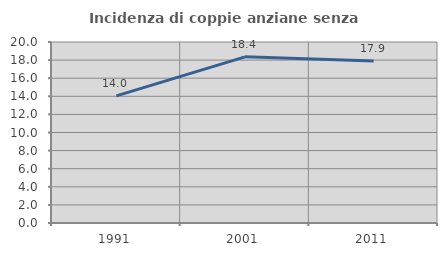
| Category | Incidenza di coppie anziane senza figli  |
|---|---|
| 1991.0 | 14.048 |
| 2001.0 | 18.357 |
| 2011.0 | 17.908 |